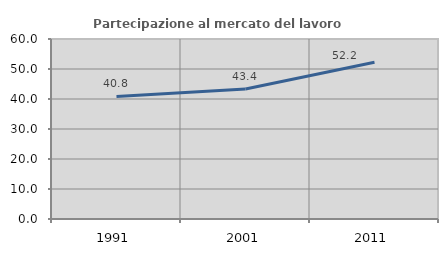
| Category | Partecipazione al mercato del lavoro  femminile |
|---|---|
| 1991.0 | 40.845 |
| 2001.0 | 43.353 |
| 2011.0 | 52.228 |